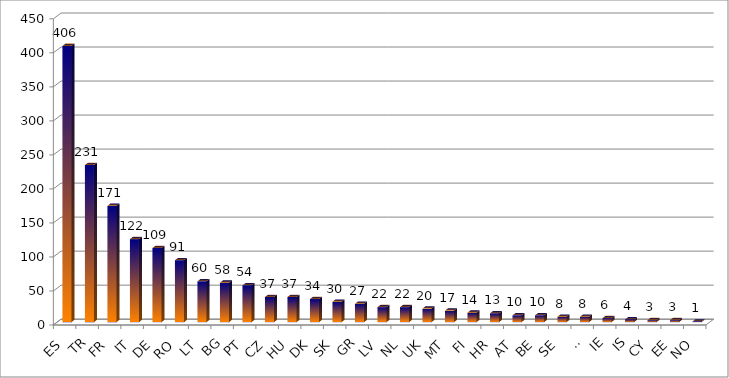
| Category | Series 0 |
|---|---|
| ES | 406 |
| TR | 231 |
| FR | 171 |
| IT | 122 |
| DE | 109 |
| RO | 91 |
| LT | 60 |
| BG | 58 |
| PT | 54 |
| CZ | 37 |
| HU | 37 |
| DK | 34 |
| SK | 30 |
| GR | 27 |
| LV | 22 |
| NL | 22 |
| UK | 20 |
| MT | 17 |
| FI | 14 |
| HR | 13 |
| AT | 10 |
| BE | 10 |
| SE | 8 |
| SI | 8 |
| IE | 6 |
| IS | 4 |
| CY | 3 |
| EE | 3 |
| NO | 1 |